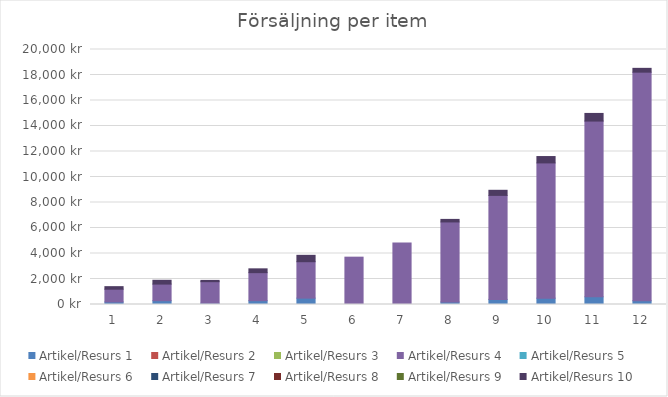
| Category | Artikel/Resurs 1 | Artikel/Resurs 2 | Artikel/Resurs 3 | Artikel/Resurs 4 | Artikel/Resurs 5 | Artikel/Resurs 6 | Artikel/Resurs 7 | Artikel/Resurs 8 | Artikel/Resurs 9 | Artikel/Resurs 10 |
|---|---|---|---|---|---|---|---|---|---|---|
| 0 | 200 | 0 | 0 | 1000 | 0 | 0 | 0 | 0 | 0 | 200 |
| 1 | 300 | 0 | 0 | 1300 | 0 | 0 | 0 | 0 | 0 | 300 |
| 2 | 100 | 0 | 0 | 1690 | 0 | 0 | 0 | 0 | 0 | 100 |
| 3 | 300 | 0 | 0 | 2197 | 0 | 0 | 0 | 0 | 0 | 300 |
| 4 | 500 | 0 | 0 | 2856.1 | 0 | 0 | 0 | 0 | 0 | 500 |
| 5 | 0 | 0 | 0 | 3712.93 | 0 | 0 | 0 | 0 | 0 | 0 |
| 6 | 0 | 0 | 0 | 4826.809 | 0 | 0 | 0 | 0 | 0 | 0 |
| 7 | 200 | 0 | 0 | 6274.852 | 0 | 0 | 0 | 0 | 0 | 200 |
| 8 | 400 | 0 | 0 | 8157.307 | 0 | 0 | 0 | 0 | 0 | 400 |
| 9 | 500 | 0 | 0 | 10604.499 | 0 | 0 | 0 | 0 | 0 | 500 |
| 10 | 600 | 0 | 0 | 13785.849 | 0 | 0 | 0 | 0 | 0 | 600 |
| 11 | 300 | 0 | 0 | 17921.604 | 0 | 0 | 0 | 0 | 0 | 300 |